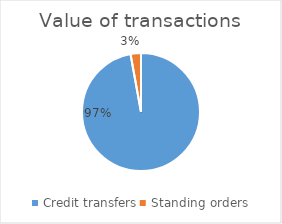
| Category | Value of transactions |
|---|---|
| Credit transfers | 2119489183882 |
| Standing orders | 62244454838 |